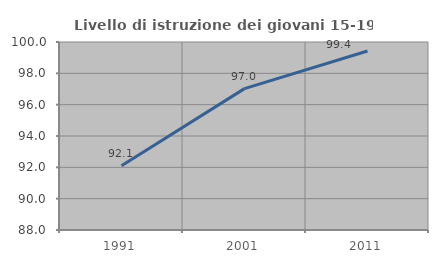
| Category | Livello di istruzione dei giovani 15-19 anni |
|---|---|
| 1991.0 | 92.105 |
| 2001.0 | 97.024 |
| 2011.0 | 99.424 |